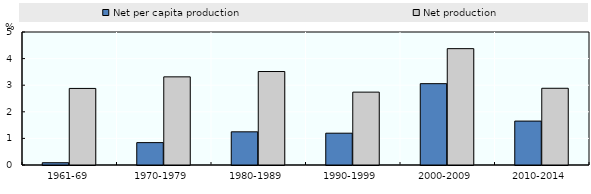
| Category | Net per capita production | Net production |
|---|---|---|
| 1961-69 | 0.085 | 2.878 |
| 1970-1979 | 0.841 | 3.314 |
| 1980-1989 | 1.247 | 3.514 |
| 1990-1999 | 1.196 | 2.739 |
| 2000-2009 | 3.058 | 4.374 |
| 2010-2014 | 1.651 | 2.885 |